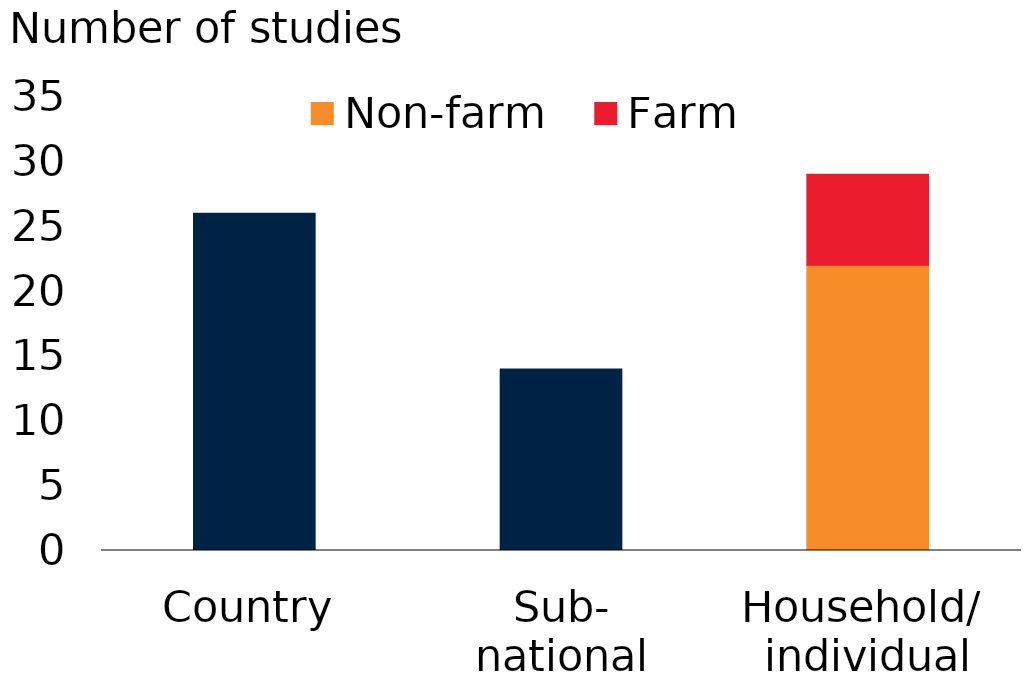
| Category | Series 0 | Non-farm | Farm |
|---|---|---|---|
| Country | 26 | 0 | 0 |
| Sub-
national | 14 | 0 | 0 |
| Household/ 
individual | 0 | 22 | 7 |